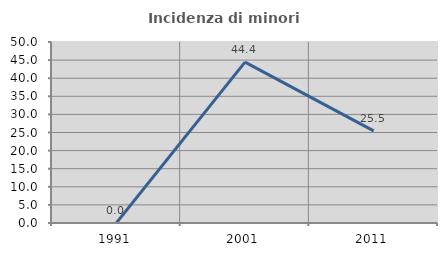
| Category | Incidenza di minori stranieri |
|---|---|
| 1991.0 | 0 |
| 2001.0 | 44.444 |
| 2011.0 | 25.455 |